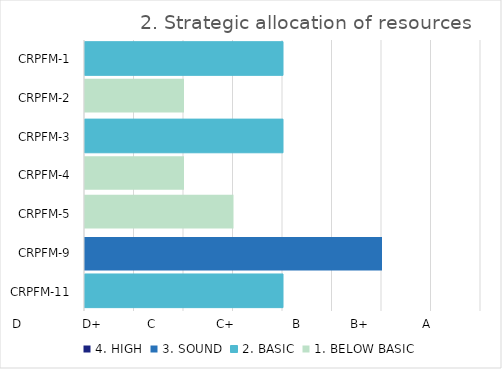
| Category | 4. HIGH | 3. SOUND | 2. BASIC | 1. BELOW BASIC |
|---|---|---|---|---|
| CRPFM-11 | 0 | 0 | 2 | 0 |
| CRPFM-9 | 0 | 3 | 0 | 0 |
| CRPFM-5 | 0 | 0 | 0 | 1.5 |
| CRPFM-4 | 0 | 0 | 0 | 1 |
| CRPFM-3 | 0 | 0 | 2 | 0 |
| CRPFM-2 | 0 | 0 | 0 | 1 |
| CRPFM-1 | 0 | 0 | 2 | 0 |